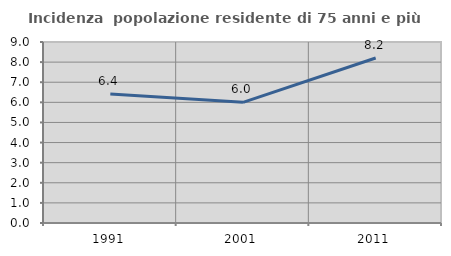
| Category | Incidenza  popolazione residente di 75 anni e più |
|---|---|
| 1991.0 | 6.413 |
| 2001.0 | 6 |
| 2011.0 | 8.205 |